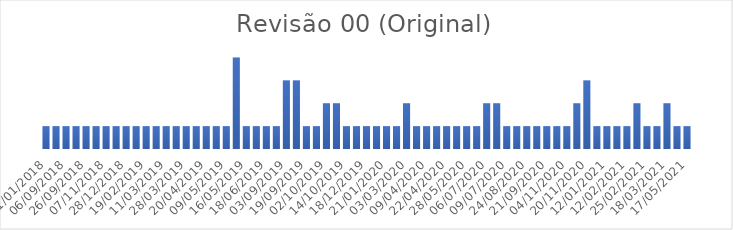
| Category | Revisão 00 (Original) |
|---|---|
| 11/01/2018 | 1 |
| 13/03/2018 | 1 |
| 06/09/2018 | 1 |
| 20/09/2018 | 1 |
| 26/09/2018 | 1 |
| 17/10/2018 | 1 |
| 07/11/2018 | 1 |
| 30/11/2018 | 1 |
| 28/12/2018 | 1 |
| 03/01/2019 | 1 |
| 19/02/2019 | 1 |
| 27/02/2019 | 1 |
| 11/03/2019 | 1 |
| 15/03/2019 | 1 |
| 28/03/2019 | 1 |
| 15/04/2019 | 1 |
| 20/04/2019 | 1 |
| 02/05/2019 | 1 |
| 09/05/2019 | 1 |
| 15/05/2019 | 4 |
| 16/05/2019 | 1 |
| 12/06/2019 | 1 |
| 18/06/2019 | 1 |
| 25/07/2019 | 1 |
| 03/09/2019 | 3 |
| 06/09/2019 | 3 |
| 19/09/2019 | 1 |
| 24/09/2019 | 1 |
| 02/10/2019 | 2 |
| 03/10/2019 | 2 |
| 14/10/2019 | 1 |
| 17/10/2019 | 1 |
| 18/12/2019 | 1 |
| 07/01/2020 | 1 |
| 21/01/2020 | 1 |
| 27/02/2020 | 1 |
| 03/03/2020 | 2 |
| 03/04/2020 | 1 |
| 09/04/2020 | 1 |
| 17/04/2020 | 1 |
| 22/04/2020 | 1 |
| 18/05/2020 | 1 |
| 28/05/2020 | 1 |
| 10/06/2020 | 1 |
| 06/07/2020 | 2 |
| 08/07/2020 | 2 |
| 09/07/2020 | 1 |
| 23/07/2020 | 1 |
| 24/08/2020 | 1 |
| 18/09/2020 | 1 |
| 21/09/2020 | 1 |
| 20/10/2020 | 1 |
| 04/11/2020 | 1 |
| 18/11/2020 | 2 |
| 20/11/2020 | 3 |
| 10/12/2020 | 1 |
| 12/01/2021 | 1 |
| 01/02/2021 | 1 |
| 12/02/2021 | 1 |
| 19/02/2021 | 2 |
| 25/02/2021 | 1 |
| 05/03/2021 | 1 |
| 18/03/2021 | 2 |
| 03/05/2021 | 1 |
| 17/05/2021 | 1 |